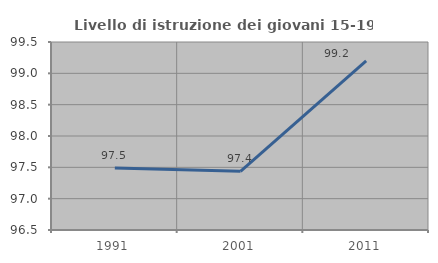
| Category | Livello di istruzione dei giovani 15-19 anni |
|---|---|
| 1991.0 | 97.491 |
| 2001.0 | 97.436 |
| 2011.0 | 99.2 |